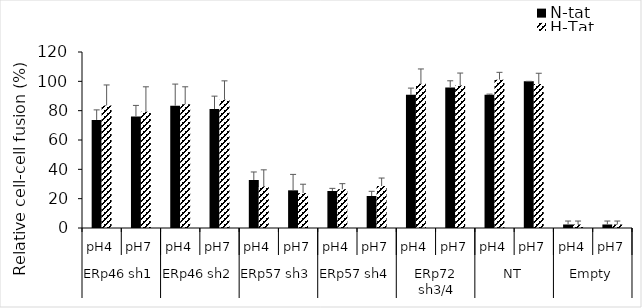
| Category | N-tat | H-Tat |
|---|---|---|
| 0 | 73.677 | 83.597 |
| 1 | 76.004 | 79.225 |
| 2 | 83.358 | 84.439 |
| 3 | 81.103 | 87.507 |
| 4 | 32.74 | 28.358 |
| 5 | 25.682 | 23.824 |
| 6 | 25.237 | 26.437 |
| 7 | 21.824 | 28.617 |
| 8 | 90.801 | 98.33 |
| 9 | 95.751 | 97.18 |
| 10 | 90.889 | 101.159 |
| 11 | 100 | 98.218 |
| 12 | 2.398 | 2.398 |
| 13 | 2.398 | 2.398 |